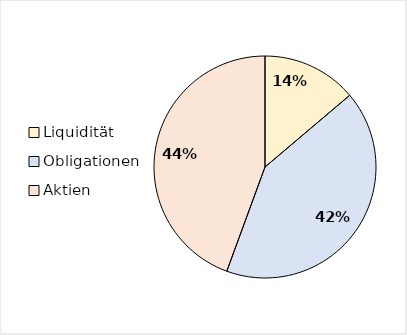
| Category | Series 0 | Series 1 |
|---|---|---|
| Liquidität | 19700 | 0.138 |
| Obligationen | 59548.5 | 0.418 |
| Aktien | 63300 | 0.444 |